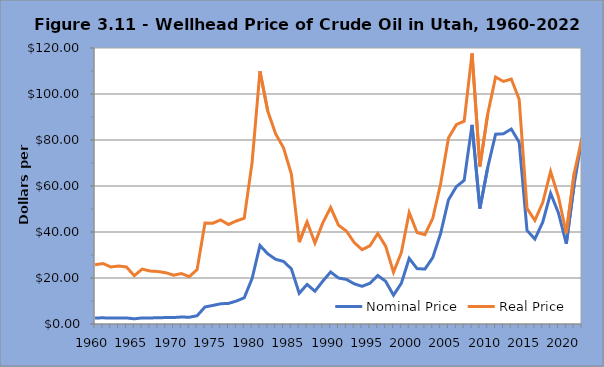
| Category | Nominal Price | Real Price |
|---|---|---|
| 1960 | 2.61 | 25.805 |
| 1961 | 2.69 | 26.329 |
| 1962 | 2.56 | 24.808 |
| 1963 | 2.64 | 25.249 |
| 1964 | 2.63 | 24.828 |
| 1965 | 2.26 | 20.997 |
| 1966 | 2.64 | 23.846 |
| 1967 | 2.63 | 23.044 |
| 1968 | 2.71 | 22.79 |
| 1969 | 2.8 | 22.328 |
| 1970 | 2.81 | 21.195 |
| 1971 | 3.04 | 21.967 |
| 1972 | 2.94 | 20.584 |
| 1973 | 3.59 | 23.663 |
| 1974 | 7.39 | 43.869 |
| 1975 | 8.06 | 43.844 |
| 1976 | 8.8 | 45.261 |
| 1977 | 8.96 | 43.27 |
| 1978 | 9.98 | 44.796 |
| 1979 | 11.41 | 45.994 |
| 1980 | 19.79 | 70.287 |
| 1981 | 34.14 | 109.915 |
| 1982 | 30.5 | 92.497 |
| 1983 | 28.12 | 82.625 |
| 1984 | 27.21 | 76.642 |
| 1985 | 23.98 | 65.222 |
| 1986 | 13.33 | 35.594 |
| 1987 | 17.22 | 44.362 |
| 1988 | 14.24 | 35.227 |
| 1989 | 18.63 | 43.969 |
| 1990 | 22.61 | 50.627 |
| 1991 | 19.99 | 42.953 |
| 1992 | 19.39 | 40.446 |
| 1993 | 17.48 | 35.402 |
| 1994 | 16.38 | 32.346 |
| 1995 | 17.71 | 34.009 |
| 1996 | 21.1 | 39.356 |
| 1997 | 18.57 | 33.86 |
| 1998 | 12.52 | 22.479 |
| 1999 | 17.69 | 31.075 |
| 2000 | 28.53 | 48.487 |
| 2001 | 24.09 | 39.808 |
| 2002 | 23.87 | 38.831 |
| 2003 | 28.88 | 45.934 |
| 2004 | 39.35 | 60.963 |
| 2005 | 53.98 | 80.888 |
| 2006 | 59.7 | 86.664 |
| 2007 | 62.48 | 88.188 |
| 2008 | 86.58 | 117.686 |
| 2009 | 50.22 | 68.506 |
| 2010 | 68.09 | 91.384 |
| 2011 | 82.53 | 107.375 |
| 2012 | 82.73 | 105.453 |
| 2013 | 84.79 | 106.518 |
| 2014 | 79.04 | 97.71 |
| 2015 | 40.69 | 50.242 |
| 2016 | 36.92 | 45.019 |
| 2017 | 44.24 | 52.819 |
| 2018 | 56.85 | 66.256 |
| 2019 | 48.32 | 55.313 |
| 2020 | 34.91 | 39.475 |
| 2021 | 60.6 | 65.45 |
| 2022 | 80.82 | 80.82 |